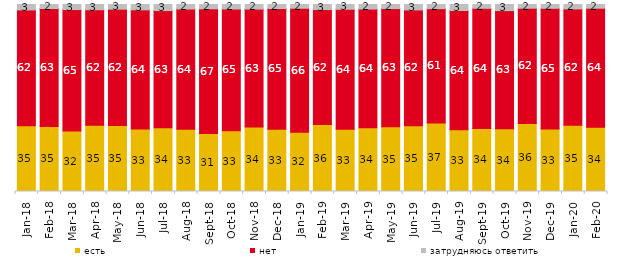
| Category | есть | нет | затрудняюсь ответить |
|---|---|---|---|
| 2018-01-01 | 35.2 | 61.9 | 2.9 |
| 2018-02-01 | 34.8 | 63.05 | 2.15 |
| 2018-03-01 | 32.35 | 64.95 | 2.7 |
| 2018-04-01 | 35.45 | 61.75 | 2.8 |
| 2018-05-01 | 35.3 | 62.15 | 2.5 |
| 2018-06-01 | 33.45 | 63.7 | 2.85 |
| 2018-07-01 | 34.05 | 62.7 | 3.25 |
| 2018-08-01 | 33.3 | 64.3 | 2.4 |
| 2018-09-01 | 31 | 66.7 | 2.3 |
| 2018-10-01 | 32.55 | 65.05 | 2.4 |
| 2018-11-01 | 34.431 | 63.124 | 2.445 |
| 2018-12-01 | 33.25 | 64.6 | 2.15 |
| 2019-01-01 | 31.75 | 66.25 | 2 |
| 2019-02-01 | 35.8 | 61.5 | 2.7 |
| 2019-03-01 | 33.317 | 64.147 | 2.536 |
| 2019-04-01 | 34.059 | 63.515 | 2.426 |
| 2019-05-01 | 34.621 | 63.2 | 2.179 |
| 2019-06-01 | 35.162 | 61.945 | 2.893 |
| 2019-07-01 | 36.634 | 61.139 | 2.228 |
| 2019-08-01 | 33.067 | 63.736 | 3.197 |
| 2019-09-01 | 33.713 | 64.257 | 2.03 |
| 2019-10-01 | 33.564 | 63.168 | 3.267 |
| 2019-11-01 | 36.337 | 61.683 | 1.98 |
| 2019-12-01 | 33.416 | 64.554 | 2.03 |
| 2020-01-01 | 35.446 | 62.178 | 2.376 |
| 2020-02-01 | 34.307 | 63.713 | 1.98 |